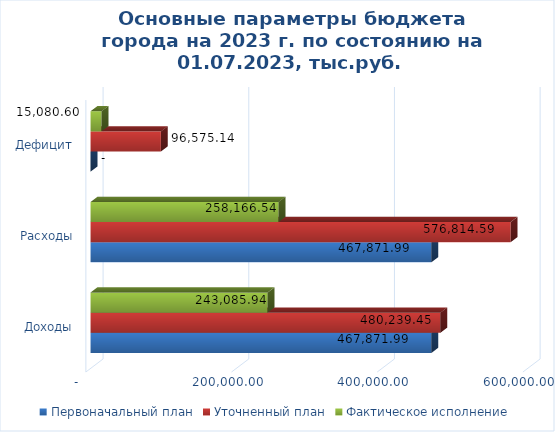
| Category | Первоначальный план | Уточненный план | Фактическое исполнение |
|---|---|---|---|
| Доходы | 467871.99 | 480239.45 | 243085.94 |
| Расходы | 467871.99 | 576814.59 | 258166.54 |
| Дефицит | 0 | 96575.14 | 15080.6 |